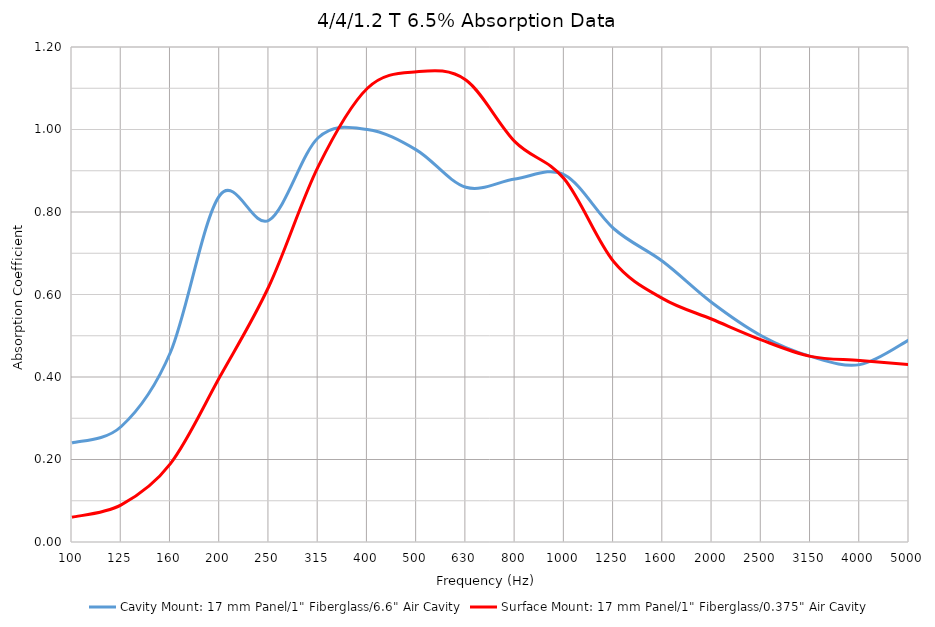
| Category | Cavity Mount: 17 mm Panel/1" Fiberglass/6.6" Air Cavity | Surface Mount: 17 mm Panel/1" Fiberglass/0.375" Air Cavity |
|---|---|---|
| 100.0 | 0.24 | 0.06 |
| 125.0 | 0.28 | 0.09 |
| 160.0 | 0.46 | 0.19 |
| 200.0 | 0.84 | 0.4 |
| 250.0 | 0.78 | 0.62 |
| 315.0 | 0.98 | 0.91 |
| 400.0 | 1 | 1.1 |
| 500.0 | 0.95 | 1.14 |
| 630.0 | 0.86 | 1.12 |
| 800.0 | 0.88 | 0.97 |
| 1000.0 | 0.89 | 0.88 |
| 1250.0 | 0.76 | 0.68 |
| 1600.0 | 0.68 | 0.59 |
| 2000.0 | 0.58 | 0.54 |
| 2500.0 | 0.5 | 0.49 |
| 3150.0 | 0.45 | 0.45 |
| 4000.0 | 0.43 | 0.44 |
| 5000.0 | 0.49 | 0.43 |